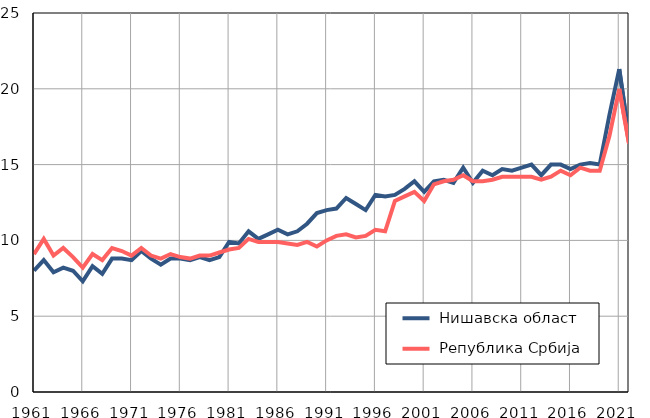
| Category |  Нишавска област |  Република Србија |
|---|---|---|
| 1961.0 | 8 | 9.1 |
| 1962.0 | 8.7 | 10.1 |
| 1963.0 | 7.9 | 9 |
| 1964.0 | 8.2 | 9.5 |
| 1965.0 | 8 | 8.9 |
| 1966.0 | 7.3 | 8.2 |
| 1967.0 | 8.3 | 9.1 |
| 1968.0 | 7.8 | 8.7 |
| 1969.0 | 8.8 | 9.5 |
| 1970.0 | 8.8 | 9.3 |
| 1971.0 | 8.7 | 9 |
| 1972.0 | 9.3 | 9.5 |
| 1973.0 | 8.8 | 9 |
| 1974.0 | 8.4 | 8.8 |
| 1975.0 | 8.8 | 9.1 |
| 1976.0 | 8.8 | 8.9 |
| 1977.0 | 8.7 | 8.8 |
| 1978.0 | 8.9 | 9 |
| 1979.0 | 8.7 | 9 |
| 1980.0 | 8.9 | 9.2 |
| 1981.0 | 9.9 | 9.4 |
| 1982.0 | 9.8 | 9.5 |
| 1983.0 | 10.6 | 10.1 |
| 1984.0 | 10.1 | 9.9 |
| 1985.0 | 10.4 | 9.9 |
| 1986.0 | 10.7 | 9.9 |
| 1987.0 | 10.4 | 9.8 |
| 1988.0 | 10.6 | 9.7 |
| 1989.0 | 11.1 | 9.9 |
| 1990.0 | 11.8 | 9.6 |
| 1991.0 | 12 | 10 |
| 1992.0 | 12.1 | 10.3 |
| 1993.0 | 12.8 | 10.4 |
| 1994.0 | 12.4 | 10.2 |
| 1995.0 | 12 | 10.3 |
| 1996.0 | 13 | 10.7 |
| 1997.0 | 12.9 | 10.6 |
| 1998.0 | 13 | 12.6 |
| 1999.0 | 13.4 | 12.9 |
| 2000.0 | 13.9 | 13.2 |
| 2001.0 | 13.2 | 12.6 |
| 2002.0 | 13.9 | 13.7 |
| 2003.0 | 14 | 13.9 |
| 2004.0 | 13.8 | 14 |
| 2005.0 | 14.8 | 14.3 |
| 2006.0 | 13.8 | 13.9 |
| 2007.0 | 14.6 | 13.9 |
| 2008.0 | 14.3 | 14 |
| 2009.0 | 14.7 | 14.2 |
| 2010.0 | 14.6 | 14.2 |
| 2011.0 | 14.8 | 14.2 |
| 2012.0 | 15 | 14.2 |
| 2013.0 | 14.3 | 14 |
| 2014.0 | 15 | 14.2 |
| 2015.0 | 15 | 14.6 |
| 2016.0 | 14.7 | 14.3 |
| 2017.0 | 15 | 14.8 |
| 2018.0 | 15.1 | 14.6 |
| 2019.0 | 15 | 14.6 |
| 2020.0 | 18.3 | 16.9 |
| 2021.0 | 21.3 | 20 |
| 2022.0 | 16.8 | 16.4 |